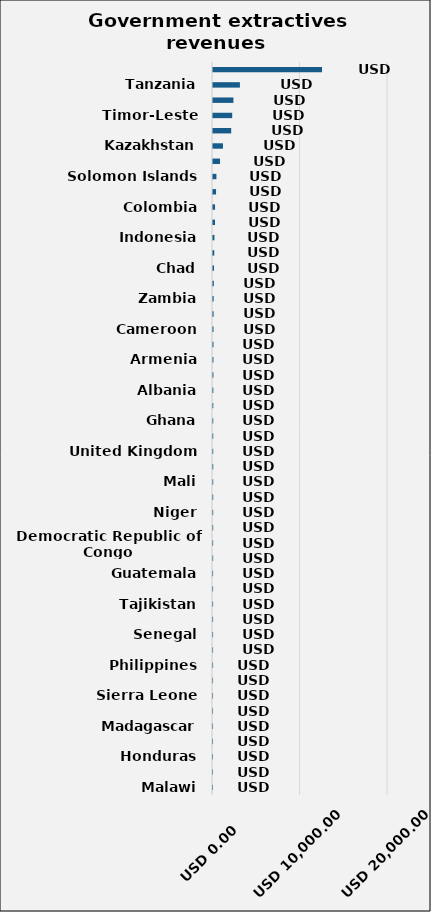
| Category | Total |
|---|---|
| Malawi | 0.654 |
| Ethiopia | 0.972 |
| Honduras | 1.511 |
| Afghanistan | 1.877 |
| Madagascar | 3.363 |
| Seychelles | 3.881 |
| Sierra Leone | 4.966 |
| Togo | 5.323 |
| Philippines | 9.356 |
| Germany | 10.093 |
| Senegal | 11.85 |
| Mozambique | 12.937 |
| Tajikistan | 13.24 |
| Burkina Faso | 13.241 |
| Guatemala | 13.472 |
| Côte d'Ivoire | 15.539 |
| Democratic Republic of Congo | 16.349 |
| Kyrgyz Republic | 19.061 |
| Niger | 19.995 |
| Liberia | 23.666 |
| Mali | 24.296 |
| São Tomé and Príncipe | 27.286 |
| United Kingdom | 27.464 |
| Guinea | 28.122 |
| Ghana | 30.073 |
| Dominican Republic | 33.393 |
| Albania | 38.036 |
| Papua New Guinea | 44.499 |
| Armenia | 49.457 |
| Myanmar | 54.276 |
| Cameroon | 60.998 |
| Mauritania | 68.55 |
| Zambia | 74.277 |
| Ukraine | 91.759 |
| Chad | 113.857 |
| Peru | 144.068 |
| Indonesia | 162.81 |
| Nigeria | 227.816 |
| Colombia | 233.325 |
| Mongolia | 348.349 |
| Solomon Islands | 389.006 |
| Republic of the Congo | 804.249 |
| Kazakhstan | 1142.128 |
| Iraq | 2080.094 |
| Timor-Leste | 2194.44 |
| Trinidad and Tobago | 2334.86 |
| Tanzania | 3075.361 |
| Norway | 12459.961 |